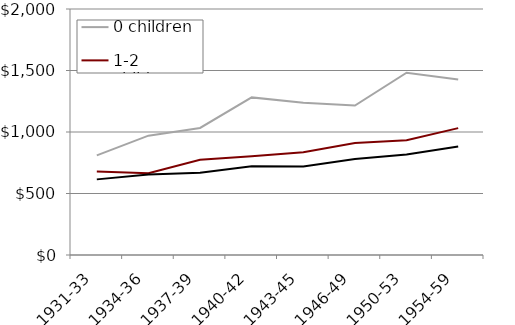
| Category | 0 children | 1-2 children | 3+ children |
|---|---|---|---|
| 1931-33 | 809.86 | 678.262 | 614.859 |
| 1934-36 | 970.084 | 665.414 | 655.227 |
| 1937-39 | 1032.937 | 773.551 | 669.444 |
| 1940-42 | 1281.277 | 802.453 | 720.714 |
| 1943-45 | 1237.334 | 835.163 | 720.481 |
| 1946-49 | 1215.283 | 910.438 | 780.549 |
| 1950-53 | 1481.746 | 933.344 | 817.678 |
| 1954-59 | 1426.015 | 1031.675 | 882.441 |